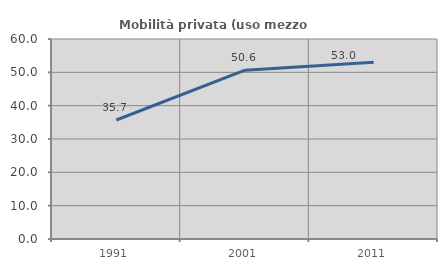
| Category | Mobilità privata (uso mezzo privato) |
|---|---|
| 1991.0 | 35.702 |
| 2001.0 | 50.635 |
| 2011.0 | 52.997 |